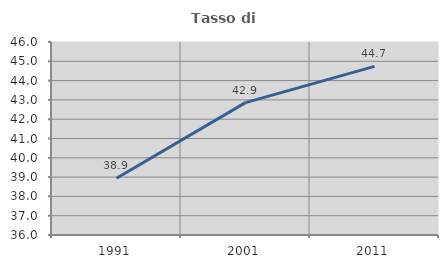
| Category | Tasso di occupazione   |
|---|---|
| 1991.0 | 38.938 |
| 2001.0 | 42.857 |
| 2011.0 | 44.737 |